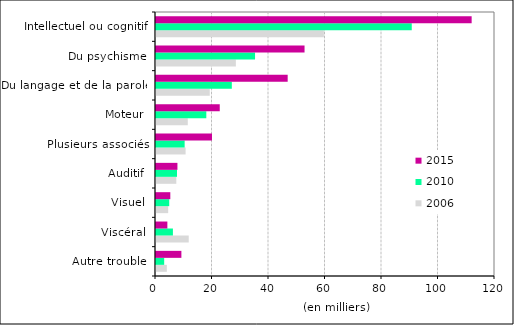
| Category | 2006 | 2010 | 2015 |
|---|---|---|---|
| Autre trouble | 3.833 | 2.898 | 8.988 |
| Viscéral | 11.582 | 5.986 | 4.022 |
| Visuel | 4.306 | 4.68 | 5.066 |
| Auditif | 7.192 | 7.442 | 7.586 |
| Plusieurs associés | 10.479 | 10.14 | 19.82 |
| Moteur | 11.247 | 17.81 | 22.567 |
| Du langage et de la parole | 19.025 | 26.838 | 46.612 |
| Du psychisme | 28.272 | 35.062 | 52.582 |
| Intellectuel ou cognitif | 59.425 | 90.532 | 111.735 |